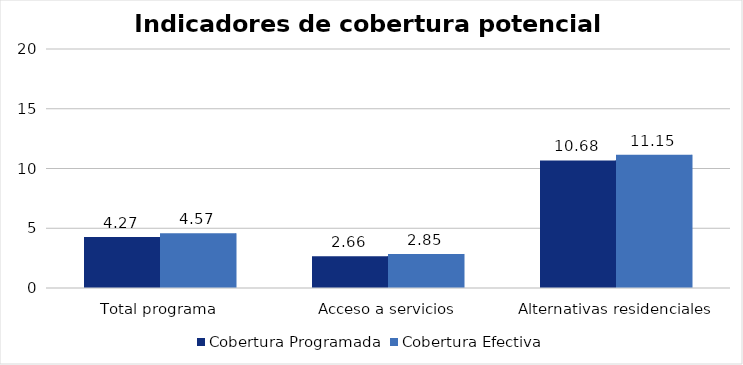
| Category | Cobertura Programada | Cobertura Efectiva |
|---|---|---|
| Total programa | 4.267 | 4.575 |
| Acceso a servicios | 2.658 | 2.847 |
| Alternativas residenciales | 10.678 | 11.151 |